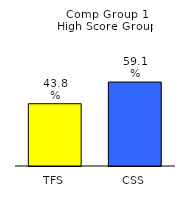
| Category | Series 0 |
|---|---|
| TFS | 0.438 |
| CSS | 0.591 |